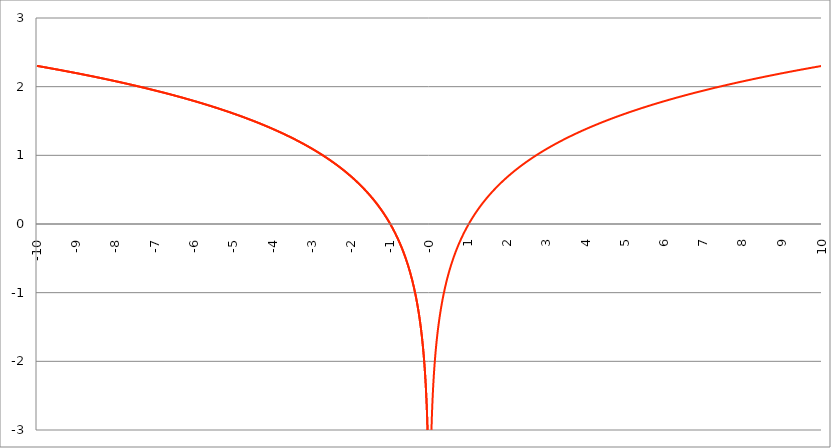
| Category | Series 1 |
|---|---|
| -10.0 | 2.303 |
| -9.99 | 2.302 |
| -9.98 | 2.301 |
| -9.97 | 2.3 |
| -9.96 | 2.299 |
| -9.95 | 2.298 |
| -9.940000000000001 | 2.297 |
| -9.930000000000001 | 2.296 |
| -9.920000000000002 | 2.295 |
| -9.91 | 2.294 |
| -9.900000000000002 | 2.293 |
| -9.890000000000002 | 2.292 |
| -9.880000000000003 | 2.291 |
| -9.870000000000003 | 2.289 |
| -9.860000000000001 | 2.288 |
| -9.850000000000003 | 2.287 |
| -9.840000000000003 | 2.286 |
| -9.830000000000004 | 2.285 |
| -9.820000000000004 | 2.284 |
| -9.810000000000004 | 2.283 |
| -9.800000000000004 | 2.282 |
| -9.790000000000004 | 2.281 |
| -9.780000000000005 | 2.28 |
| -9.770000000000005 | 2.279 |
| -9.760000000000005 | 2.278 |
| -9.750000000000005 | 2.277 |
| -9.740000000000006 | 2.276 |
| -9.730000000000006 | 2.275 |
| -9.720000000000006 | 2.274 |
| -9.710000000000006 | 2.273 |
| -9.700000000000006 | 2.272 |
| -9.690000000000007 | 2.271 |
| -9.680000000000007 | 2.27 |
| -9.670000000000007 | 2.269 |
| -9.660000000000007 | 2.268 |
| -9.650000000000007 | 2.267 |
| -9.640000000000008 | 2.266 |
| -9.630000000000008 | 2.265 |
| -9.620000000000008 | 2.264 |
| -9.610000000000008 | 2.263 |
| -9.600000000000009 | 2.262 |
| -9.590000000000009 | 2.261 |
| -9.580000000000007 | 2.26 |
| -9.57000000000001 | 2.259 |
| -9.56000000000001 | 2.258 |
| -9.55000000000001 | 2.257 |
| -9.54000000000001 | 2.255 |
| -9.53000000000001 | 2.254 |
| -9.52000000000001 | 2.253 |
| -9.51000000000001 | 2.252 |
| -9.50000000000001 | 2.251 |
| -9.49000000000001 | 2.25 |
| -9.48000000000001 | 2.249 |
| -9.47000000000001 | 2.248 |
| -9.46000000000001 | 2.247 |
| -9.45000000000001 | 2.246 |
| -9.44000000000001 | 2.245 |
| -9.430000000000012 | 2.244 |
| -9.420000000000012 | 2.243 |
| -9.410000000000013 | 2.242 |
| -9.400000000000013 | 2.241 |
| -9.390000000000011 | 2.24 |
| -9.380000000000013 | 2.239 |
| -9.370000000000013 | 2.238 |
| -9.360000000000014 | 2.236 |
| -9.350000000000014 | 2.235 |
| -9.340000000000014 | 2.234 |
| -9.330000000000014 | 2.233 |
| -9.320000000000014 | 2.232 |
| -9.310000000000015 | 2.231 |
| -9.300000000000013 | 2.23 |
| -9.290000000000015 | 2.229 |
| -9.280000000000015 | 2.228 |
| -9.270000000000016 | 2.227 |
| -9.260000000000016 | 2.226 |
| -9.250000000000014 | 2.225 |
| -9.240000000000016 | 2.224 |
| -9.230000000000016 | 2.222 |
| -9.220000000000017 | 2.221 |
| -9.210000000000017 | 2.22 |
| -9.200000000000017 | 2.219 |
| -9.190000000000017 | 2.218 |
| -9.180000000000017 | 2.217 |
| -9.170000000000018 | 2.216 |
| -9.160000000000016 | 2.215 |
| -9.150000000000018 | 2.214 |
| -9.140000000000018 | 2.213 |
| -9.130000000000019 | 2.212 |
| -9.120000000000019 | 2.21 |
| -9.110000000000017 | 2.209 |
| -9.10000000000002 | 2.208 |
| -9.09000000000002 | 2.207 |
| -9.08000000000002 | 2.206 |
| -9.07000000000002 | 2.205 |
| -9.06000000000002 | 2.204 |
| -9.05000000000002 | 2.203 |
| -9.04000000000002 | 2.202 |
| -9.03000000000002 | 2.201 |
| -9.020000000000021 | 2.199 |
| -9.010000000000021 | 2.198 |
| -9.000000000000021 | 2.197 |
| -8.990000000000022 | 2.196 |
| -8.980000000000022 | 2.195 |
| -8.97000000000002 | 2.194 |
| -8.960000000000022 | 2.193 |
| -8.950000000000022 | 2.192 |
| -8.940000000000023 | 2.191 |
| -8.930000000000023 | 2.189 |
| -8.920000000000023 | 2.188 |
| -8.910000000000023 | 2.187 |
| -8.900000000000023 | 2.186 |
| -8.890000000000024 | 2.185 |
| -8.880000000000024 | 2.184 |
| -8.870000000000024 | 2.183 |
| -8.860000000000024 | 2.182 |
| -8.850000000000025 | 2.18 |
| -8.840000000000025 | 2.179 |
| -8.830000000000025 | 2.178 |
| -8.820000000000025 | 2.177 |
| -8.810000000000025 | 2.176 |
| -8.800000000000026 | 2.175 |
| -8.790000000000026 | 2.174 |
| -8.780000000000026 | 2.172 |
| -8.770000000000026 | 2.171 |
| -8.760000000000026 | 2.17 |
| -8.750000000000027 | 2.169 |
| -8.740000000000027 | 2.168 |
| -8.730000000000027 | 2.167 |
| -8.720000000000027 | 2.166 |
| -8.710000000000027 | 2.164 |
| -8.700000000000028 | 2.163 |
| -8.690000000000028 | 2.162 |
| -8.680000000000028 | 2.161 |
| -8.670000000000028 | 2.16 |
| -8.660000000000029 | 2.159 |
| -8.650000000000029 | 2.158 |
| -8.640000000000029 | 2.156 |
| -8.63000000000003 | 2.155 |
| -8.62000000000003 | 2.154 |
| -8.61000000000003 | 2.153 |
| -8.60000000000003 | 2.152 |
| -8.59000000000003 | 2.151 |
| -8.58000000000003 | 2.149 |
| -8.57000000000003 | 2.148 |
| -8.56000000000003 | 2.147 |
| -8.55000000000003 | 2.146 |
| -8.540000000000031 | 2.145 |
| -8.530000000000031 | 2.144 |
| -8.520000000000032 | 2.142 |
| -8.510000000000032 | 2.141 |
| -8.50000000000003 | 2.14 |
| -8.490000000000032 | 2.139 |
| -8.480000000000032 | 2.138 |
| -8.470000000000033 | 2.137 |
| -8.460000000000033 | 2.135 |
| -8.450000000000033 | 2.134 |
| -8.440000000000033 | 2.133 |
| -8.430000000000033 | 2.132 |
| -8.420000000000034 | 2.131 |
| -8.410000000000032 | 2.129 |
| -8.400000000000034 | 2.128 |
| -8.390000000000034 | 2.127 |
| -8.380000000000035 | 2.126 |
| -8.370000000000035 | 2.125 |
| -8.360000000000033 | 2.123 |
| -8.350000000000035 | 2.122 |
| -8.340000000000035 | 2.121 |
| -8.330000000000036 | 2.12 |
| -8.320000000000036 | 2.119 |
| -8.310000000000034 | 2.117 |
| -8.300000000000036 | 2.116 |
| -8.290000000000036 | 2.115 |
| -8.280000000000037 | 2.114 |
| -8.270000000000037 | 2.113 |
| -8.260000000000037 | 2.111 |
| -8.250000000000037 | 2.11 |
| -8.240000000000038 | 2.109 |
| -8.230000000000038 | 2.108 |
| -8.220000000000038 | 2.107 |
| -8.210000000000038 | 2.105 |
| -8.200000000000038 | 2.104 |
| -8.190000000000039 | 2.103 |
| -8.180000000000039 | 2.102 |
| -8.170000000000037 | 2.1 |
| -8.16000000000004 | 2.099 |
| -8.15000000000004 | 2.098 |
| -8.14000000000004 | 2.097 |
| -8.13000000000004 | 2.096 |
| -8.12000000000004 | 2.094 |
| -8.11000000000004 | 2.093 |
| -8.10000000000004 | 2.092 |
| -8.09000000000004 | 2.091 |
| -8.08000000000004 | 2.089 |
| -8.07000000000004 | 2.088 |
| -8.06000000000004 | 2.087 |
| -8.05000000000004 | 2.086 |
| -8.040000000000042 | 2.084 |
| -8.03000000000004 | 2.083 |
| -8.020000000000042 | 2.082 |
| -8.010000000000042 | 2.081 |
| -8.000000000000043 | 2.079 |
| -7.990000000000043 | 2.078 |
| -7.980000000000043 | 2.077 |
| -7.970000000000043 | 2.076 |
| -7.960000000000043 | 2.074 |
| -7.950000000000044 | 2.073 |
| -7.940000000000044 | 2.072 |
| -7.930000000000044 | 2.071 |
| -7.920000000000044 | 2.069 |
| -7.910000000000044 | 2.068 |
| -7.900000000000044 | 2.067 |
| -7.890000000000045 | 2.066 |
| -7.880000000000045 | 2.064 |
| -7.870000000000045 | 2.063 |
| -7.860000000000046 | 2.062 |
| -7.850000000000046 | 2.061 |
| -7.840000000000046 | 2.059 |
| -7.830000000000046 | 2.058 |
| -7.820000000000046 | 2.057 |
| -7.810000000000047 | 2.055 |
| -7.800000000000047 | 2.054 |
| -7.790000000000047 | 2.053 |
| -7.780000000000047 | 2.052 |
| -7.770000000000047 | 2.05 |
| -7.760000000000048 | 2.049 |
| -7.750000000000048 | 2.048 |
| -7.740000000000048 | 2.046 |
| -7.730000000000048 | 2.045 |
| -7.720000000000049 | 2.044 |
| -7.710000000000049 | 2.043 |
| -7.700000000000049 | 2.041 |
| -7.690000000000049 | 2.04 |
| -7.680000000000049 | 2.039 |
| -7.67000000000005 | 2.037 |
| -7.66000000000005 | 2.036 |
| -7.65000000000005 | 2.035 |
| -7.64000000000005 | 2.033 |
| -7.63000000000005 | 2.032 |
| -7.620000000000051 | 2.031 |
| -7.610000000000051 | 2.029 |
| -7.600000000000051 | 2.028 |
| -7.590000000000051 | 2.027 |
| -7.580000000000052 | 2.026 |
| -7.570000000000052 | 2.024 |
| -7.560000000000052 | 2.023 |
| -7.550000000000052 | 2.022 |
| -7.540000000000052 | 2.02 |
| -7.530000000000053 | 2.019 |
| -7.520000000000053 | 2.018 |
| -7.510000000000053 | 2.016 |
| -7.500000000000053 | 2.015 |
| -7.490000000000053 | 2.014 |
| -7.480000000000054 | 2.012 |
| -7.470000000000054 | 2.011 |
| -7.460000000000054 | 2.01 |
| -7.450000000000054 | 2.008 |
| -7.440000000000054 | 2.007 |
| -7.430000000000054 | 2.006 |
| -7.420000000000055 | 2.004 |
| -7.410000000000055 | 2.003 |
| -7.400000000000055 | 2.001 |
| -7.390000000000056 | 2 |
| -7.380000000000056 | 1.999 |
| -7.370000000000056 | 1.997 |
| -7.360000000000056 | 1.996 |
| -7.350000000000056 | 1.995 |
| -7.340000000000057 | 1.993 |
| -7.330000000000057 | 1.992 |
| -7.320000000000057 | 1.991 |
| -7.310000000000057 | 1.989 |
| -7.300000000000058 | 1.988 |
| -7.290000000000058 | 1.987 |
| -7.280000000000058 | 1.985 |
| -7.270000000000058 | 1.984 |
| -7.260000000000058 | 1.982 |
| -7.250000000000059 | 1.981 |
| -7.240000000000059 | 1.98 |
| -7.23000000000006 | 1.978 |
| -7.220000000000059 | 1.977 |
| -7.210000000000059 | 1.975 |
| -7.20000000000006 | 1.974 |
| -7.19000000000006 | 1.973 |
| -7.18000000000006 | 1.971 |
| -7.17000000000006 | 1.97 |
| -7.160000000000061 | 1.969 |
| -7.150000000000061 | 1.967 |
| -7.140000000000061 | 1.966 |
| -7.130000000000061 | 1.964 |
| -7.120000000000061 | 1.963 |
| -7.110000000000062 | 1.962 |
| -7.100000000000062 | 1.96 |
| -7.090000000000062 | 1.959 |
| -7.080000000000062 | 1.957 |
| -7.070000000000062 | 1.956 |
| -7.060000000000063 | 1.954 |
| -7.050000000000063 | 1.953 |
| -7.040000000000063 | 1.952 |
| -7.030000000000063 | 1.95 |
| -7.020000000000064 | 1.949 |
| -7.010000000000064 | 1.947 |
| -7.000000000000064 | 1.946 |
| -6.990000000000064 | 1.944 |
| -6.980000000000064 | 1.943 |
| -6.970000000000064 | 1.942 |
| -6.960000000000064 | 1.94 |
| -6.950000000000064 | 1.939 |
| -6.940000000000065 | 1.937 |
| -6.930000000000065 | 1.936 |
| -6.920000000000065 | 1.934 |
| -6.910000000000065 | 1.933 |
| -6.900000000000066 | 1.932 |
| -6.890000000000066 | 1.93 |
| -6.880000000000066 | 1.929 |
| -6.870000000000066 | 1.927 |
| -6.860000000000067 | 1.926 |
| -6.850000000000067 | 1.924 |
| -6.840000000000067 | 1.923 |
| -6.830000000000067 | 1.921 |
| -6.820000000000068 | 1.92 |
| -6.810000000000068 | 1.918 |
| -6.800000000000068 | 1.917 |
| -6.790000000000068 | 1.915 |
| -6.780000000000068 | 1.914 |
| -6.770000000000068 | 1.913 |
| -6.760000000000069 | 1.911 |
| -6.75000000000007 | 1.91 |
| -6.74000000000007 | 1.908 |
| -6.73000000000007 | 1.907 |
| -6.72000000000007 | 1.905 |
| -6.71000000000007 | 1.904 |
| -6.70000000000007 | 1.902 |
| -6.69000000000007 | 1.901 |
| -6.680000000000071 | 1.899 |
| -6.670000000000071 | 1.898 |
| -6.660000000000071 | 1.896 |
| -6.650000000000071 | 1.895 |
| -6.640000000000072 | 1.893 |
| -6.630000000000072 | 1.892 |
| -6.620000000000072 | 1.89 |
| -6.610000000000072 | 1.889 |
| -6.600000000000072 | 1.887 |
| -6.590000000000073 | 1.886 |
| -6.580000000000073 | 1.884 |
| -6.570000000000073 | 1.883 |
| -6.560000000000073 | 1.881 |
| -6.550000000000074 | 1.879 |
| -6.540000000000074 | 1.878 |
| -6.530000000000074 | 1.876 |
| -6.520000000000074 | 1.875 |
| -6.510000000000074 | 1.873 |
| -6.500000000000074 | 1.872 |
| -6.490000000000074 | 1.87 |
| -6.480000000000074 | 1.869 |
| -6.470000000000075 | 1.867 |
| -6.460000000000075 | 1.866 |
| -6.450000000000075 | 1.864 |
| -6.440000000000075 | 1.863 |
| -6.430000000000076 | 1.861 |
| -6.420000000000076 | 1.859 |
| -6.410000000000076 | 1.858 |
| -6.400000000000076 | 1.856 |
| -6.390000000000077 | 1.855 |
| -6.380000000000077 | 1.853 |
| -6.370000000000077 | 1.852 |
| -6.360000000000078 | 1.85 |
| -6.350000000000078 | 1.848 |
| -6.340000000000078 | 1.847 |
| -6.330000000000078 | 1.845 |
| -6.320000000000078 | 1.844 |
| -6.310000000000079 | 1.842 |
| -6.300000000000079 | 1.841 |
| -6.29000000000008 | 1.839 |
| -6.28000000000008 | 1.837 |
| -6.27000000000008 | 1.836 |
| -6.26000000000008 | 1.834 |
| -6.25000000000008 | 1.833 |
| -6.24000000000008 | 1.831 |
| -6.23000000000008 | 1.829 |
| -6.220000000000081 | 1.828 |
| -6.210000000000081 | 1.826 |
| -6.200000000000081 | 1.825 |
| -6.190000000000081 | 1.823 |
| -6.180000000000081 | 1.821 |
| -6.170000000000082 | 1.82 |
| -6.160000000000082 | 1.818 |
| -6.150000000000082 | 1.816 |
| -6.140000000000082 | 1.815 |
| -6.130000000000082 | 1.813 |
| -6.120000000000083 | 1.812 |
| -6.110000000000083 | 1.81 |
| -6.100000000000083 | 1.808 |
| -6.090000000000083 | 1.807 |
| -6.080000000000084 | 1.805 |
| -6.070000000000084 | 1.803 |
| -6.060000000000084 | 1.802 |
| -6.050000000000084 | 1.8 |
| -6.040000000000084 | 1.798 |
| -6.030000000000084 | 1.797 |
| -6.020000000000085 | 1.795 |
| -6.010000000000085 | 1.793 |
| -6.000000000000085 | 1.792 |
| -5.990000000000085 | 1.79 |
| -5.980000000000085 | 1.788 |
| -5.970000000000085 | 1.787 |
| -5.960000000000086 | 1.785 |
| -5.950000000000086 | 1.783 |
| -5.940000000000086 | 1.782 |
| -5.930000000000086 | 1.78 |
| -5.920000000000087 | 1.778 |
| -5.910000000000087 | 1.777 |
| -5.900000000000087 | 1.775 |
| -5.890000000000088 | 1.773 |
| -5.880000000000088 | 1.772 |
| -5.870000000000088 | 1.77 |
| -5.860000000000088 | 1.768 |
| -5.850000000000088 | 1.766 |
| -5.840000000000089 | 1.765 |
| -5.830000000000089 | 1.763 |
| -5.820000000000089 | 1.761 |
| -5.810000000000089 | 1.76 |
| -5.800000000000089 | 1.758 |
| -5.79000000000009 | 1.756 |
| -5.78000000000009 | 1.754 |
| -5.77000000000009 | 1.753 |
| -5.76000000000009 | 1.751 |
| -5.750000000000091 | 1.749 |
| -5.740000000000091 | 1.747 |
| -5.730000000000091 | 1.746 |
| -5.720000000000091 | 1.744 |
| -5.710000000000091 | 1.742 |
| -5.700000000000092 | 1.74 |
| -5.690000000000092 | 1.739 |
| -5.680000000000092 | 1.737 |
| -5.670000000000092 | 1.735 |
| -5.660000000000092 | 1.733 |
| -5.650000000000093 | 1.732 |
| -5.640000000000093 | 1.73 |
| -5.630000000000093 | 1.728 |
| -5.620000000000093 | 1.726 |
| -5.610000000000093 | 1.725 |
| -5.600000000000094 | 1.723 |
| -5.590000000000094 | 1.721 |
| -5.580000000000094 | 1.719 |
| -5.570000000000094 | 1.717 |
| -5.560000000000095 | 1.716 |
| -5.550000000000095 | 1.714 |
| -5.540000000000095 | 1.712 |
| -5.530000000000095 | 1.71 |
| -5.520000000000095 | 1.708 |
| -5.510000000000096 | 1.707 |
| -5.500000000000096 | 1.705 |
| -5.490000000000096 | 1.703 |
| -5.480000000000096 | 1.701 |
| -5.470000000000096 | 1.699 |
| -5.460000000000097 | 1.697 |
| -5.450000000000097 | 1.696 |
| -5.440000000000097 | 1.694 |
| -5.430000000000097 | 1.692 |
| -5.420000000000098 | 1.69 |
| -5.410000000000098 | 1.688 |
| -5.400000000000098 | 1.686 |
| -5.390000000000098 | 1.685 |
| -5.380000000000098 | 1.683 |
| -5.370000000000099 | 1.681 |
| -5.360000000000099 | 1.679 |
| -5.350000000000099 | 1.677 |
| -5.340000000000099 | 1.675 |
| -5.330000000000099 | 1.673 |
| -5.3200000000001 | 1.671 |
| -5.3100000000001 | 1.67 |
| -5.3000000000001 | 1.668 |
| -5.2900000000001 | 1.666 |
| -5.2800000000001 | 1.664 |
| -5.2700000000001 | 1.662 |
| -5.260000000000101 | 1.66 |
| -5.250000000000101 | 1.658 |
| -5.240000000000101 | 1.656 |
| -5.230000000000101 | 1.654 |
| -5.220000000000102 | 1.652 |
| -5.210000000000102 | 1.651 |
| -5.200000000000102 | 1.649 |
| -5.190000000000103 | 1.647 |
| -5.180000000000103 | 1.645 |
| -5.170000000000103 | 1.643 |
| -5.160000000000103 | 1.641 |
| -5.150000000000103 | 1.639 |
| -5.140000000000104 | 1.637 |
| -5.130000000000104 | 1.635 |
| -5.120000000000104 | 1.633 |
| -5.110000000000104 | 1.631 |
| -5.100000000000104 | 1.629 |
| -5.090000000000104 | 1.627 |
| -5.080000000000104 | 1.625 |
| -5.070000000000105 | 1.623 |
| -5.060000000000105 | 1.621 |
| -5.050000000000105 | 1.619 |
| -5.040000000000105 | 1.617 |
| -5.030000000000105 | 1.615 |
| -5.020000000000106 | 1.613 |
| -5.010000000000106 | 1.611 |
| -5.000000000000106 | 1.609 |
| -4.990000000000106 | 1.607 |
| -4.980000000000106 | 1.605 |
| -4.970000000000107 | 1.603 |
| -4.960000000000107 | 1.601 |
| -4.950000000000107 | 1.599 |
| -4.940000000000107 | 1.597 |
| -4.930000000000108 | 1.595 |
| -4.920000000000108 | 1.593 |
| -4.910000000000108 | 1.591 |
| -4.900000000000108 | 1.589 |
| -4.890000000000109 | 1.587 |
| -4.88000000000011 | 1.585 |
| -4.87000000000011 | 1.583 |
| -4.86000000000011 | 1.581 |
| -4.85000000000011 | 1.579 |
| -4.84000000000011 | 1.577 |
| -4.83000000000011 | 1.575 |
| -4.82000000000011 | 1.573 |
| -4.810000000000111 | 1.571 |
| -4.800000000000111 | 1.569 |
| -4.790000000000111 | 1.567 |
| -4.780000000000111 | 1.564 |
| -4.770000000000111 | 1.562 |
| -4.760000000000112 | 1.56 |
| -4.750000000000112 | 1.558 |
| -4.740000000000112 | 1.556 |
| -4.730000000000112 | 1.554 |
| -4.720000000000112 | 1.552 |
| -4.710000000000113 | 1.55 |
| -4.700000000000113 | 1.548 |
| -4.690000000000113 | 1.545 |
| -4.680000000000113 | 1.543 |
| -4.670000000000114 | 1.541 |
| -4.660000000000114 | 1.539 |
| -4.650000000000114 | 1.537 |
| -4.640000000000114 | 1.535 |
| -4.630000000000114 | 1.533 |
| -4.620000000000115 | 1.53 |
| -4.610000000000115 | 1.528 |
| -4.600000000000115 | 1.526 |
| -4.590000000000115 | 1.524 |
| -4.580000000000115 | 1.522 |
| -4.570000000000115 | 1.52 |
| -4.560000000000116 | 1.517 |
| -4.550000000000116 | 1.515 |
| -4.540000000000116 | 1.513 |
| -4.530000000000116 | 1.511 |
| -4.520000000000117 | 1.509 |
| -4.510000000000117 | 1.506 |
| -4.500000000000117 | 1.504 |
| -4.490000000000117 | 1.502 |
| -4.480000000000117 | 1.5 |
| -4.470000000000117 | 1.497 |
| -4.460000000000118 | 1.495 |
| -4.450000000000118 | 1.493 |
| -4.440000000000118 | 1.491 |
| -4.430000000000118 | 1.488 |
| -4.420000000000119 | 1.486 |
| -4.41000000000012 | 1.484 |
| -4.40000000000012 | 1.482 |
| -4.39000000000012 | 1.479 |
| -4.38000000000012 | 1.477 |
| -4.37000000000012 | 1.475 |
| -4.36000000000012 | 1.472 |
| -4.35000000000012 | 1.47 |
| -4.34000000000012 | 1.468 |
| -4.33000000000012 | 1.466 |
| -4.320000000000121 | 1.463 |
| -4.310000000000121 | 1.461 |
| -4.300000000000121 | 1.459 |
| -4.290000000000121 | 1.456 |
| -4.280000000000121 | 1.454 |
| -4.270000000000122 | 1.452 |
| -4.260000000000122 | 1.449 |
| -4.250000000000122 | 1.447 |
| -4.240000000000122 | 1.445 |
| -4.230000000000122 | 1.442 |
| -4.220000000000123 | 1.44 |
| -4.210000000000123 | 1.437 |
| -4.200000000000123 | 1.435 |
| -4.190000000000124 | 1.433 |
| -4.180000000000124 | 1.43 |
| -4.170000000000124 | 1.428 |
| -4.160000000000124 | 1.426 |
| -4.150000000000124 | 1.423 |
| -4.140000000000124 | 1.421 |
| -4.130000000000125 | 1.418 |
| -4.120000000000125 | 1.416 |
| -4.110000000000125 | 1.413 |
| -4.100000000000125 | 1.411 |
| -4.090000000000125 | 1.409 |
| -4.080000000000126 | 1.406 |
| -4.070000000000126 | 1.404 |
| -4.060000000000126 | 1.401 |
| -4.050000000000126 | 1.399 |
| -4.040000000000127 | 1.396 |
| -4.030000000000127 | 1.394 |
| -4.020000000000127 | 1.391 |
| -4.010000000000127 | 1.389 |
| -4.000000000000127 | 1.386 |
| -3.990000000000128 | 1.384 |
| -3.980000000000128 | 1.381 |
| -3.970000000000129 | 1.379 |
| -3.960000000000129 | 1.376 |
| -3.950000000000129 | 1.374 |
| -3.940000000000129 | 1.371 |
| -3.930000000000129 | 1.369 |
| -3.92000000000013 | 1.366 |
| -3.91000000000013 | 1.364 |
| -3.90000000000013 | 1.361 |
| -3.89000000000013 | 1.358 |
| -3.88000000000013 | 1.356 |
| -3.870000000000131 | 1.353 |
| -3.860000000000131 | 1.351 |
| -3.850000000000131 | 1.348 |
| -3.840000000000131 | 1.345 |
| -3.830000000000131 | 1.343 |
| -3.820000000000132 | 1.34 |
| -3.810000000000132 | 1.338 |
| -3.800000000000132 | 1.335 |
| -3.790000000000132 | 1.332 |
| -3.780000000000132 | 1.33 |
| -3.770000000000133 | 1.327 |
| -3.760000000000133 | 1.324 |
| -3.750000000000133 | 1.322 |
| -3.740000000000133 | 1.319 |
| -3.730000000000134 | 1.316 |
| -3.720000000000134 | 1.314 |
| -3.710000000000134 | 1.311 |
| -3.700000000000134 | 1.308 |
| -3.690000000000134 | 1.306 |
| -3.680000000000135 | 1.303 |
| -3.670000000000135 | 1.3 |
| -3.660000000000135 | 1.297 |
| -3.650000000000135 | 1.295 |
| -3.640000000000135 | 1.292 |
| -3.630000000000136 | 1.289 |
| -3.620000000000136 | 1.286 |
| -3.610000000000136 | 1.284 |
| -3.600000000000136 | 1.281 |
| -3.590000000000137 | 1.278 |
| -3.580000000000137 | 1.275 |
| -3.570000000000137 | 1.273 |
| -3.560000000000137 | 1.27 |
| -3.550000000000137 | 1.267 |
| -3.540000000000138 | 1.264 |
| -3.530000000000138 | 1.261 |
| -3.520000000000138 | 1.258 |
| -3.510000000000138 | 1.256 |
| -3.500000000000139 | 1.253 |
| -3.490000000000139 | 1.25 |
| -3.480000000000139 | 1.247 |
| -3.470000000000139 | 1.244 |
| -3.460000000000139 | 1.241 |
| -3.45000000000014 | 1.238 |
| -3.44000000000014 | 1.235 |
| -3.43000000000014 | 1.233 |
| -3.42000000000014 | 1.23 |
| -3.41000000000014 | 1.227 |
| -3.400000000000141 | 1.224 |
| -3.390000000000141 | 1.221 |
| -3.380000000000141 | 1.218 |
| -3.370000000000141 | 1.215 |
| -3.360000000000141 | 1.212 |
| -3.350000000000142 | 1.209 |
| -3.340000000000142 | 1.206 |
| -3.330000000000142 | 1.203 |
| -3.320000000000142 | 1.2 |
| -3.310000000000143 | 1.197 |
| -3.300000000000143 | 1.194 |
| -3.290000000000143 | 1.191 |
| -3.280000000000143 | 1.188 |
| -3.270000000000143 | 1.185 |
| -3.260000000000144 | 1.182 |
| -3.250000000000144 | 1.179 |
| -3.240000000000144 | 1.176 |
| -3.230000000000144 | 1.172 |
| -3.220000000000145 | 1.169 |
| -3.210000000000145 | 1.166 |
| -3.200000000000145 | 1.163 |
| -3.190000000000145 | 1.16 |
| -3.180000000000145 | 1.157 |
| -3.170000000000146 | 1.154 |
| -3.160000000000146 | 1.151 |
| -3.150000000000146 | 1.147 |
| -3.140000000000146 | 1.144 |
| -3.130000000000146 | 1.141 |
| -3.120000000000147 | 1.138 |
| -3.110000000000147 | 1.135 |
| -3.100000000000147 | 1.131 |
| -3.090000000000147 | 1.128 |
| -3.080000000000147 | 1.125 |
| -3.070000000000148 | 1.122 |
| -3.060000000000148 | 1.118 |
| -3.050000000000148 | 1.115 |
| -3.040000000000148 | 1.112 |
| -3.030000000000149 | 1.109 |
| -3.020000000000149 | 1.105 |
| -3.010000000000149 | 1.102 |
| -3.000000000000149 | 1.099 |
| -2.990000000000149 | 1.095 |
| -2.98000000000015 | 1.092 |
| -2.97000000000015 | 1.089 |
| -2.96000000000015 | 1.085 |
| -2.95000000000015 | 1.082 |
| -2.94000000000015 | 1.078 |
| -2.930000000000151 | 1.075 |
| -2.920000000000151 | 1.072 |
| -2.910000000000151 | 1.068 |
| -2.900000000000151 | 1.065 |
| -2.890000000000151 | 1.061 |
| -2.880000000000152 | 1.058 |
| -2.870000000000152 | 1.054 |
| -2.860000000000152 | 1.051 |
| -2.850000000000152 | 1.047 |
| -2.840000000000153 | 1.044 |
| -2.830000000000153 | 1.04 |
| -2.820000000000153 | 1.037 |
| -2.810000000000153 | 1.033 |
| -2.800000000000153 | 1.03 |
| -2.790000000000154 | 1.026 |
| -2.780000000000154 | 1.022 |
| -2.770000000000154 | 1.019 |
| -2.760000000000154 | 1.015 |
| -2.750000000000154 | 1.012 |
| -2.740000000000155 | 1.008 |
| -2.730000000000155 | 1.004 |
| -2.720000000000155 | 1.001 |
| -2.710000000000155 | 0.997 |
| -2.700000000000156 | 0.993 |
| -2.690000000000156 | 0.99 |
| -2.680000000000156 | 0.986 |
| -2.670000000000156 | 0.982 |
| -2.660000000000156 | 0.978 |
| -2.650000000000157 | 0.975 |
| -2.640000000000157 | 0.971 |
| -2.630000000000157 | 0.967 |
| -2.620000000000157 | 0.963 |
| -2.610000000000157 | 0.959 |
| -2.600000000000158 | 0.956 |
| -2.590000000000158 | 0.952 |
| -2.580000000000158 | 0.948 |
| -2.570000000000158 | 0.944 |
| -2.560000000000159 | 0.94 |
| -2.550000000000159 | 0.936 |
| -2.54000000000016 | 0.932 |
| -2.530000000000159 | 0.928 |
| -2.520000000000159 | 0.924 |
| -2.51000000000016 | 0.92 |
| -2.50000000000016 | 0.916 |
| -2.49000000000016 | 0.912 |
| -2.48000000000016 | 0.908 |
| -2.47000000000016 | 0.904 |
| -2.460000000000161 | 0.9 |
| -2.450000000000161 | 0.896 |
| -2.440000000000161 | 0.892 |
| -2.430000000000161 | 0.888 |
| -2.420000000000162 | 0.884 |
| -2.410000000000162 | 0.88 |
| -2.400000000000162 | 0.875 |
| -2.390000000000162 | 0.871 |
| -2.380000000000162 | 0.867 |
| -2.370000000000163 | 0.863 |
| -2.360000000000163 | 0.859 |
| -2.350000000000163 | 0.854 |
| -2.340000000000163 | 0.85 |
| -2.330000000000163 | 0.846 |
| -2.320000000000164 | 0.842 |
| -2.310000000000164 | 0.837 |
| -2.300000000000164 | 0.833 |
| -2.290000000000164 | 0.829 |
| -2.280000000000165 | 0.824 |
| -2.270000000000165 | 0.82 |
| -2.260000000000165 | 0.815 |
| -2.250000000000165 | 0.811 |
| -2.240000000000165 | 0.806 |
| -2.230000000000166 | 0.802 |
| -2.220000000000166 | 0.798 |
| -2.210000000000166 | 0.793 |
| -2.200000000000166 | 0.788 |
| -2.190000000000166 | 0.784 |
| -2.180000000000167 | 0.779 |
| -2.170000000000167 | 0.775 |
| -2.160000000000167 | 0.77 |
| -2.150000000000167 | 0.765 |
| -2.140000000000168 | 0.761 |
| -2.130000000000168 | 0.756 |
| -2.120000000000168 | 0.751 |
| -2.110000000000168 | 0.747 |
| -2.100000000000168 | 0.742 |
| -2.090000000000169 | 0.737 |
| -2.080000000000169 | 0.732 |
| -2.070000000000169 | 0.728 |
| -2.060000000000169 | 0.723 |
| -2.050000000000169 | 0.718 |
| -2.04000000000017 | 0.713 |
| -2.03000000000017 | 0.708 |
| -2.02000000000017 | 0.703 |
| -2.01000000000017 | 0.698 |
| -2.000000000000171 | 0.693 |
| -1.99000000000017 | 0.688 |
| -1.98000000000017 | 0.683 |
| -1.97000000000017 | 0.678 |
| -1.96000000000017 | 0.673 |
| -1.95000000000017 | 0.668 |
| -1.94000000000017 | 0.663 |
| -1.93000000000017 | 0.658 |
| -1.92000000000017 | 0.652 |
| -1.91000000000017 | 0.647 |
| -1.90000000000017 | 0.642 |
| -1.89000000000017 | 0.637 |
| -1.88000000000017 | 0.631 |
| -1.87000000000017 | 0.626 |
| -1.86000000000017 | 0.621 |
| -1.85000000000017 | 0.615 |
| -1.84000000000017 | 0.61 |
| -1.83000000000017 | 0.604 |
| -1.82000000000017 | 0.599 |
| -1.81000000000017 | 0.593 |
| -1.80000000000017 | 0.588 |
| -1.79000000000017 | 0.582 |
| -1.78000000000017 | 0.577 |
| -1.77000000000017 | 0.571 |
| -1.76000000000017 | 0.565 |
| -1.75000000000017 | 0.56 |
| -1.74000000000017 | 0.554 |
| -1.73000000000017 | 0.548 |
| -1.72000000000017 | 0.542 |
| -1.71000000000017 | 0.536 |
| -1.70000000000017 | 0.531 |
| -1.69000000000017 | 0.525 |
| -1.68000000000017 | 0.519 |
| -1.67000000000017 | 0.513 |
| -1.66000000000017 | 0.507 |
| -1.65000000000017 | 0.501 |
| -1.64000000000017 | 0.495 |
| -1.63000000000017 | 0.489 |
| -1.62000000000017 | 0.482 |
| -1.61000000000017 | 0.476 |
| -1.60000000000017 | 0.47 |
| -1.59000000000017 | 0.464 |
| -1.58000000000017 | 0.457 |
| -1.57000000000017 | 0.451 |
| -1.56000000000017 | 0.445 |
| -1.55000000000017 | 0.438 |
| -1.54000000000017 | 0.432 |
| -1.53000000000017 | 0.425 |
| -1.52000000000017 | 0.419 |
| -1.51000000000017 | 0.412 |
| -1.50000000000017 | 0.405 |
| -1.49000000000017 | 0.399 |
| -1.48000000000017 | 0.392 |
| -1.47000000000017 | 0.385 |
| -1.46000000000017 | 0.378 |
| -1.45000000000017 | 0.372 |
| -1.44000000000017 | 0.365 |
| -1.43000000000017 | 0.358 |
| -1.42000000000017 | 0.351 |
| -1.41000000000017 | 0.344 |
| -1.40000000000017 | 0.336 |
| -1.39000000000017 | 0.329 |
| -1.38000000000017 | 0.322 |
| -1.37000000000017 | 0.315 |
| -1.36000000000017 | 0.307 |
| -1.35000000000017 | 0.3 |
| -1.34000000000017 | 0.293 |
| -1.33000000000017 | 0.285 |
| -1.32000000000017 | 0.278 |
| -1.31000000000017 | 0.27 |
| -1.30000000000017 | 0.262 |
| -1.29000000000017 | 0.255 |
| -1.28000000000017 | 0.247 |
| -1.27000000000017 | 0.239 |
| -1.26000000000017 | 0.231 |
| -1.25000000000017 | 0.223 |
| -1.24000000000017 | 0.215 |
| -1.23000000000017 | 0.207 |
| -1.22000000000017 | 0.199 |
| -1.21000000000017 | 0.191 |
| -1.20000000000017 | 0.182 |
| -1.19000000000017 | 0.174 |
| -1.18000000000017 | 0.166 |
| -1.17000000000017 | 0.157 |
| -1.16000000000017 | 0.148 |
| -1.15000000000017 | 0.14 |
| -1.14000000000017 | 0.131 |
| -1.13000000000017 | 0.122 |
| -1.12000000000017 | 0.113 |
| -1.11000000000017 | 0.104 |
| -1.10000000000017 | 0.095 |
| -1.09000000000017 | 0.086 |
| -1.08000000000017 | 0.077 |
| -1.07000000000017 | 0.068 |
| -1.06000000000017 | 0.058 |
| -1.05000000000017 | 0.049 |
| -1.04000000000017 | 0.039 |
| -1.03000000000017 | 0.03 |
| -1.02000000000017 | 0.02 |
| -1.01000000000017 | 0.01 |
| -1.00000000000017 | 0 |
| -0.99000000000017 | -0.01 |
| -0.98000000000017 | -0.02 |
| -0.97000000000017 | -0.03 |
| -0.96000000000017 | -0.041 |
| -0.95000000000017 | -0.051 |
| -0.94000000000017 | -0.062 |
| -0.93000000000017 | -0.073 |
| -0.92000000000017 | -0.083 |
| -0.91000000000017 | -0.094 |
| -0.90000000000017 | -0.105 |
| -0.890000000000169 | -0.117 |
| -0.880000000000169 | -0.128 |
| -0.870000000000169 | -0.139 |
| -0.860000000000169 | -0.151 |
| -0.850000000000169 | -0.163 |
| -0.840000000000169 | -0.174 |
| -0.830000000000169 | -0.186 |
| -0.820000000000169 | -0.198 |
| -0.810000000000169 | -0.211 |
| -0.800000000000169 | -0.223 |
| -0.790000000000169 | -0.236 |
| -0.780000000000169 | -0.248 |
| -0.770000000000169 | -0.261 |
| -0.760000000000169 | -0.274 |
| -0.750000000000169 | -0.288 |
| -0.740000000000169 | -0.301 |
| -0.730000000000169 | -0.315 |
| -0.720000000000169 | -0.329 |
| -0.710000000000169 | -0.342 |
| -0.700000000000169 | -0.357 |
| -0.690000000000169 | -0.371 |
| -0.680000000000169 | -0.386 |
| -0.670000000000169 | -0.4 |
| -0.660000000000169 | -0.416 |
| -0.650000000000169 | -0.431 |
| -0.640000000000169 | -0.446 |
| -0.630000000000169 | -0.462 |
| -0.620000000000169 | -0.478 |
| -0.610000000000169 | -0.494 |
| -0.600000000000169 | -0.511 |
| -0.590000000000169 | -0.528 |
| -0.580000000000169 | -0.545 |
| -0.570000000000169 | -0.562 |
| -0.560000000000169 | -0.58 |
| -0.550000000000169 | -0.598 |
| -0.540000000000169 | -0.616 |
| -0.530000000000169 | -0.635 |
| -0.520000000000169 | -0.654 |
| -0.510000000000169 | -0.673 |
| -0.500000000000169 | -0.693 |
| -0.490000000000169 | -0.713 |
| -0.480000000000169 | -0.734 |
| -0.470000000000169 | -0.755 |
| -0.460000000000169 | -0.777 |
| -0.450000000000169 | -0.799 |
| -0.440000000000169 | -0.821 |
| -0.430000000000169 | -0.844 |
| -0.420000000000169 | -0.868 |
| -0.410000000000169 | -0.892 |
| -0.400000000000169 | -0.916 |
| -0.390000000000169 | -0.942 |
| -0.380000000000169 | -0.968 |
| -0.370000000000169 | -0.994 |
| -0.360000000000169 | -1.022 |
| -0.350000000000169 | -1.05 |
| -0.340000000000169 | -1.079 |
| -0.330000000000169 | -1.109 |
| -0.320000000000169 | -1.139 |
| -0.310000000000169 | -1.171 |
| -0.300000000000169 | -1.204 |
| -0.290000000000169 | -1.238 |
| -0.280000000000169 | -1.273 |
| -0.270000000000169 | -1.309 |
| -0.260000000000169 | -1.347 |
| -0.250000000000169 | -1.386 |
| -0.240000000000169 | -1.427 |
| -0.230000000000169 | -1.47 |
| -0.220000000000169 | -1.514 |
| -0.210000000000169 | -1.561 |
| -0.200000000000169 | -1.609 |
| -0.190000000000169 | -1.661 |
| -0.180000000000169 | -1.715 |
| -0.170000000000169 | -1.772 |
| -0.160000000000169 | -1.833 |
| -0.150000000000169 | -1.897 |
| -0.140000000000169 | -1.966 |
| -0.130000000000169 | -2.04 |
| -0.120000000000169 | -2.12 |
| -0.110000000000169 | -2.207 |
| -0.100000000000169 | -2.303 |
| -0.0900000000001689 | -2.408 |
| -0.0800000000001689 | -2.526 |
| -0.0700000000001689 | -2.659 |
| -0.0600000000001689 | -2.813 |
| -0.0500000000001689 | -2.996 |
| -0.0400000000001689 | -3.219 |
| -0.0300000000001689 | -3.507 |
| -0.0200000000001689 | -3.912 |
| -0.0100000000001689 | -4.605 |
| -1.6888920817415e-13 | -29.41 |
| 0.00999999999983111 | -4.605 |
| 0.0199999999998311 | -3.912 |
| 0.0299999999998311 | -3.507 |
| 0.0399999999998311 | -3.219 |
| 0.0499999999998311 | -2.996 |
| 0.0599999999998311 | -2.813 |
| 0.0699999999998311 | -2.659 |
| 0.0799999999998311 | -2.526 |
| 0.0899999999998311 | -2.408 |
| 0.0999999999998311 | -2.303 |
| 0.109999999999831 | -2.207 |
| 0.119999999999831 | -2.12 |
| 0.129999999999831 | -2.04 |
| 0.139999999999831 | -1.966 |
| 0.149999999999831 | -1.897 |
| 0.159999999999831 | -1.833 |
| 0.169999999999831 | -1.772 |
| 0.179999999999831 | -1.715 |
| 0.189999999999831 | -1.661 |
| 0.199999999999831 | -1.609 |
| 0.209999999999831 | -1.561 |
| 0.219999999999831 | -1.514 |
| 0.229999999999831 | -1.47 |
| 0.239999999999831 | -1.427 |
| 0.249999999999831 | -1.386 |
| 0.259999999999831 | -1.347 |
| 0.269999999999831 | -1.309 |
| 0.279999999999831 | -1.273 |
| 0.289999999999831 | -1.238 |
| 0.299999999999831 | -1.204 |
| 0.309999999999831 | -1.171 |
| 0.319999999999831 | -1.139 |
| 0.329999999999831 | -1.109 |
| 0.339999999999831 | -1.079 |
| 0.349999999999831 | -1.05 |
| 0.359999999999831 | -1.022 |
| 0.369999999999831 | -0.994 |
| 0.379999999999831 | -0.968 |
| 0.389999999999831 | -0.942 |
| 0.399999999999831 | -0.916 |
| 0.409999999999831 | -0.892 |
| 0.419999999999831 | -0.868 |
| 0.429999999999831 | -0.844 |
| 0.439999999999831 | -0.821 |
| 0.449999999999831 | -0.799 |
| 0.459999999999831 | -0.777 |
| 0.469999999999831 | -0.755 |
| 0.479999999999831 | -0.734 |
| 0.489999999999831 | -0.713 |
| 0.499999999999831 | -0.693 |
| 0.509999999999831 | -0.673 |
| 0.519999999999831 | -0.654 |
| 0.529999999999831 | -0.635 |
| 0.539999999999831 | -0.616 |
| 0.549999999999831 | -0.598 |
| 0.559999999999831 | -0.58 |
| 0.569999999999831 | -0.562 |
| 0.579999999999831 | -0.545 |
| 0.589999999999831 | -0.528 |
| 0.599999999999831 | -0.511 |
| 0.609999999999831 | -0.494 |
| 0.619999999999831 | -0.478 |
| 0.629999999999831 | -0.462 |
| 0.639999999999831 | -0.446 |
| 0.649999999999831 | -0.431 |
| 0.659999999999831 | -0.416 |
| 0.669999999999831 | -0.4 |
| 0.679999999999831 | -0.386 |
| 0.689999999999831 | -0.371 |
| 0.699999999999831 | -0.357 |
| 0.709999999999831 | -0.342 |
| 0.719999999999831 | -0.329 |
| 0.729999999999831 | -0.315 |
| 0.739999999999831 | -0.301 |
| 0.749999999999832 | -0.288 |
| 0.759999999999832 | -0.274 |
| 0.769999999999832 | -0.261 |
| 0.779999999999832 | -0.248 |
| 0.789999999999832 | -0.236 |
| 0.799999999999832 | -0.223 |
| 0.809999999999832 | -0.211 |
| 0.819999999999832 | -0.198 |
| 0.829999999999832 | -0.186 |
| 0.839999999999832 | -0.174 |
| 0.849999999999832 | -0.163 |
| 0.859999999999832 | -0.151 |
| 0.869999999999832 | -0.139 |
| 0.879999999999832 | -0.128 |
| 0.889999999999832 | -0.117 |
| 0.899999999999832 | -0.105 |
| 0.909999999999832 | -0.094 |
| 0.919999999999832 | -0.083 |
| 0.929999999999832 | -0.073 |
| 0.939999999999832 | -0.062 |
| 0.949999999999832 | -0.051 |
| 0.959999999999832 | -0.041 |
| 0.969999999999832 | -0.03 |
| 0.979999999999832 | -0.02 |
| 0.989999999999832 | -0.01 |
| 0.999999999999832 | 0 |
| 1.009999999999832 | 0.01 |
| 1.019999999999832 | 0.02 |
| 1.029999999999832 | 0.03 |
| 1.039999999999832 | 0.039 |
| 1.049999999999832 | 0.049 |
| 1.059999999999832 | 0.058 |
| 1.069999999999832 | 0.068 |
| 1.079999999999832 | 0.077 |
| 1.089999999999832 | 0.086 |
| 1.099999999999832 | 0.095 |
| 1.109999999999832 | 0.104 |
| 1.119999999999832 | 0.113 |
| 1.129999999999832 | 0.122 |
| 1.139999999999832 | 0.131 |
| 1.149999999999832 | 0.14 |
| 1.159999999999832 | 0.148 |
| 1.169999999999832 | 0.157 |
| 1.179999999999832 | 0.166 |
| 1.189999999999832 | 0.174 |
| 1.199999999999832 | 0.182 |
| 1.209999999999832 | 0.191 |
| 1.219999999999832 | 0.199 |
| 1.229999999999832 | 0.207 |
| 1.239999999999832 | 0.215 |
| 1.249999999999832 | 0.223 |
| 1.259999999999832 | 0.231 |
| 1.269999999999832 | 0.239 |
| 1.279999999999832 | 0.247 |
| 1.289999999999832 | 0.255 |
| 1.299999999999832 | 0.262 |
| 1.309999999999832 | 0.27 |
| 1.319999999999832 | 0.278 |
| 1.329999999999832 | 0.285 |
| 1.339999999999832 | 0.293 |
| 1.349999999999832 | 0.3 |
| 1.359999999999832 | 0.307 |
| 1.369999999999832 | 0.315 |
| 1.379999999999832 | 0.322 |
| 1.389999999999832 | 0.329 |
| 1.399999999999832 | 0.336 |
| 1.409999999999832 | 0.344 |
| 1.419999999999832 | 0.351 |
| 1.429999999999832 | 0.358 |
| 1.439999999999832 | 0.365 |
| 1.449999999999832 | 0.372 |
| 1.459999999999832 | 0.378 |
| 1.469999999999832 | 0.385 |
| 1.479999999999832 | 0.392 |
| 1.489999999999832 | 0.399 |
| 1.499999999999832 | 0.405 |
| 1.509999999999832 | 0.412 |
| 1.519999999999832 | 0.419 |
| 1.529999999999832 | 0.425 |
| 1.539999999999832 | 0.432 |
| 1.549999999999832 | 0.438 |
| 1.559999999999832 | 0.445 |
| 1.569999999999832 | 0.451 |
| 1.579999999999832 | 0.457 |
| 1.589999999999832 | 0.464 |
| 1.599999999999832 | 0.47 |
| 1.609999999999832 | 0.476 |
| 1.619999999999832 | 0.482 |
| 1.629999999999832 | 0.489 |
| 1.639999999999832 | 0.495 |
| 1.649999999999832 | 0.501 |
| 1.659999999999832 | 0.507 |
| 1.669999999999832 | 0.513 |
| 1.679999999999832 | 0.519 |
| 1.689999999999832 | 0.525 |
| 1.699999999999832 | 0.531 |
| 1.709999999999832 | 0.536 |
| 1.719999999999832 | 0.542 |
| 1.729999999999832 | 0.548 |
| 1.739999999999832 | 0.554 |
| 1.749999999999832 | 0.56 |
| 1.759999999999832 | 0.565 |
| 1.769999999999832 | 0.571 |
| 1.779999999999832 | 0.577 |
| 1.789999999999832 | 0.582 |
| 1.799999999999832 | 0.588 |
| 1.809999999999832 | 0.593 |
| 1.819999999999832 | 0.599 |
| 1.829999999999832 | 0.604 |
| 1.839999999999832 | 0.61 |
| 1.849999999999832 | 0.615 |
| 1.859999999999832 | 0.621 |
| 1.869999999999832 | 0.626 |
| 1.879999999999832 | 0.631 |
| 1.889999999999832 | 0.637 |
| 1.899999999999832 | 0.642 |
| 1.909999999999832 | 0.647 |
| 1.919999999999832 | 0.652 |
| 1.929999999999832 | 0.658 |
| 1.939999999999832 | 0.663 |
| 1.949999999999833 | 0.668 |
| 1.959999999999833 | 0.673 |
| 1.969999999999833 | 0.678 |
| 1.979999999999833 | 0.683 |
| 1.989999999999833 | 0.688 |
| 1.999999999999833 | 0.693 |
| 2.009999999999832 | 0.698 |
| 2.019999999999832 | 0.703 |
| 2.029999999999832 | 0.708 |
| 2.039999999999832 | 0.713 |
| 2.049999999999832 | 0.718 |
| 2.059999999999831 | 0.723 |
| 2.069999999999831 | 0.728 |
| 2.079999999999831 | 0.732 |
| 2.089999999999831 | 0.737 |
| 2.09999999999983 | 0.742 |
| 2.10999999999983 | 0.747 |
| 2.11999999999983 | 0.751 |
| 2.12999999999983 | 0.756 |
| 2.13999999999983 | 0.761 |
| 2.149999999999829 | 0.765 |
| 2.159999999999829 | 0.77 |
| 2.169999999999829 | 0.775 |
| 2.179999999999829 | 0.779 |
| 2.189999999999829 | 0.784 |
| 2.199999999999828 | 0.788 |
| 2.209999999999828 | 0.793 |
| 2.219999999999828 | 0.798 |
| 2.229999999999828 | 0.802 |
| 2.239999999999827 | 0.806 |
| 2.249999999999827 | 0.811 |
| 2.259999999999827 | 0.815 |
| 2.269999999999827 | 0.82 |
| 2.279999999999827 | 0.824 |
| 2.289999999999826 | 0.829 |
| 2.299999999999826 | 0.833 |
| 2.309999999999826 | 0.837 |
| 2.319999999999826 | 0.842 |
| 2.329999999999825 | 0.846 |
| 2.339999999999825 | 0.85 |
| 2.349999999999825 | 0.854 |
| 2.359999999999825 | 0.859 |
| 2.369999999999825 | 0.863 |
| 2.379999999999824 | 0.867 |
| 2.389999999999824 | 0.871 |
| 2.399999999999824 | 0.875 |
| 2.409999999999824 | 0.88 |
| 2.419999999999824 | 0.884 |
| 2.429999999999823 | 0.888 |
| 2.439999999999823 | 0.892 |
| 2.449999999999823 | 0.896 |
| 2.459999999999823 | 0.9 |
| 2.469999999999823 | 0.904 |
| 2.479999999999822 | 0.908 |
| 2.489999999999822 | 0.912 |
| 2.499999999999822 | 0.916 |
| 2.509999999999822 | 0.92 |
| 2.519999999999821 | 0.924 |
| 2.529999999999821 | 0.928 |
| 2.539999999999821 | 0.932 |
| 2.549999999999821 | 0.936 |
| 2.559999999999821 | 0.94 |
| 2.56999999999982 | 0.944 |
| 2.57999999999982 | 0.948 |
| 2.58999999999982 | 0.952 |
| 2.59999999999982 | 0.956 |
| 2.609999999999819 | 0.959 |
| 2.619999999999819 | 0.963 |
| 2.629999999999819 | 0.967 |
| 2.639999999999819 | 0.971 |
| 2.649999999999819 | 0.975 |
| 2.659999999999818 | 0.978 |
| 2.669999999999818 | 0.982 |
| 2.679999999999818 | 0.986 |
| 2.689999999999818 | 0.99 |
| 2.699999999999818 | 0.993 |
| 2.709999999999817 | 0.997 |
| 2.719999999999817 | 1.001 |
| 2.729999999999817 | 1.004 |
| 2.739999999999817 | 1.008 |
| 2.749999999999817 | 1.012 |
| 2.759999999999816 | 1.015 |
| 2.769999999999816 | 1.019 |
| 2.779999999999816 | 1.022 |
| 2.789999999999816 | 1.026 |
| 2.799999999999815 | 1.03 |
| 2.809999999999815 | 1.033 |
| 2.819999999999815 | 1.037 |
| 2.829999999999815 | 1.04 |
| 2.839999999999815 | 1.044 |
| 2.849999999999814 | 1.047 |
| 2.859999999999814 | 1.051 |
| 2.869999999999814 | 1.054 |
| 2.879999999999814 | 1.058 |
| 2.889999999999814 | 1.061 |
| 2.899999999999813 | 1.065 |
| 2.909999999999813 | 1.068 |
| 2.919999999999813 | 1.072 |
| 2.929999999999813 | 1.075 |
| 2.939999999999813 | 1.078 |
| 2.949999999999812 | 1.082 |
| 2.959999999999812 | 1.085 |
| 2.969999999999812 | 1.089 |
| 2.979999999999812 | 1.092 |
| 2.989999999999811 | 1.095 |
| 2.999999999999811 | 1.099 |
| 3.009999999999811 | 1.102 |
| 3.019999999999811 | 1.105 |
| 3.029999999999811 | 1.109 |
| 3.03999999999981 | 1.112 |
| 3.04999999999981 | 1.115 |
| 3.05999999999981 | 1.118 |
| 3.06999999999981 | 1.122 |
| 3.07999999999981 | 1.125 |
| 3.089999999999809 | 1.128 |
| 3.099999999999809 | 1.131 |
| 3.109999999999809 | 1.135 |
| 3.119999999999809 | 1.138 |
| 3.129999999999808 | 1.141 |
| 3.139999999999808 | 1.144 |
| 3.149999999999808 | 1.147 |
| 3.159999999999808 | 1.151 |
| 3.169999999999808 | 1.154 |
| 3.179999999999807 | 1.157 |
| 3.189999999999807 | 1.16 |
| 3.199999999999807 | 1.163 |
| 3.209999999999807 | 1.166 |
| 3.219999999999807 | 1.169 |
| 3.229999999999806 | 1.172 |
| 3.239999999999806 | 1.176 |
| 3.249999999999806 | 1.179 |
| 3.259999999999806 | 1.182 |
| 3.269999999999805 | 1.185 |
| 3.279999999999805 | 1.188 |
| 3.289999999999805 | 1.191 |
| 3.299999999999805 | 1.194 |
| 3.309999999999805 | 1.197 |
| 3.319999999999804 | 1.2 |
| 3.329999999999804 | 1.203 |
| 3.339999999999804 | 1.206 |
| 3.349999999999804 | 1.209 |
| 3.359999999999804 | 1.212 |
| 3.369999999999803 | 1.215 |
| 3.379999999999803 | 1.218 |
| 3.389999999999803 | 1.221 |
| 3.399999999999803 | 1.224 |
| 3.409999999999802 | 1.227 |
| 3.419999999999802 | 1.23 |
| 3.429999999999802 | 1.233 |
| 3.439999999999802 | 1.235 |
| 3.449999999999802 | 1.238 |
| 3.459999999999801 | 1.241 |
| 3.469999999999801 | 1.244 |
| 3.479999999999801 | 1.247 |
| 3.489999999999801 | 1.25 |
| 3.499999999999801 | 1.253 |
| 3.5099999999998 | 1.256 |
| 3.5199999999998 | 1.258 |
| 3.5299999999998 | 1.261 |
| 3.5399999999998 | 1.264 |
| 3.5499999999998 | 1.267 |
| 3.559999999999799 | 1.27 |
| 3.569999999999799 | 1.273 |
| 3.579999999999799 | 1.275 |
| 3.589999999999799 | 1.278 |
| 3.599999999999798 | 1.281 |
| 3.609999999999798 | 1.284 |
| 3.619999999999798 | 1.286 |
| 3.629999999999798 | 1.289 |
| 3.639999999999798 | 1.292 |
| 3.649999999999797 | 1.295 |
| 3.659999999999797 | 1.297 |
| 3.669999999999797 | 1.3 |
| 3.679999999999797 | 1.303 |
| 3.689999999999796 | 1.306 |
| 3.699999999999796 | 1.308 |
| 3.709999999999796 | 1.311 |
| 3.719999999999796 | 1.314 |
| 3.729999999999796 | 1.316 |
| 3.739999999999795 | 1.319 |
| 3.749999999999795 | 1.322 |
| 3.759999999999795 | 1.324 |
| 3.769999999999795 | 1.327 |
| 3.779999999999795 | 1.33 |
| 3.789999999999794 | 1.332 |
| 3.799999999999794 | 1.335 |
| 3.809999999999794 | 1.338 |
| 3.819999999999794 | 1.34 |
| 3.829999999999794 | 1.343 |
| 3.839999999999793 | 1.345 |
| 3.849999999999793 | 1.348 |
| 3.859999999999793 | 1.351 |
| 3.869999999999793 | 1.353 |
| 3.879999999999792 | 1.356 |
| 3.889999999999792 | 1.358 |
| 3.899999999999792 | 1.361 |
| 3.909999999999792 | 1.364 |
| 3.919999999999792 | 1.366 |
| 3.929999999999791 | 1.369 |
| 3.939999999999791 | 1.371 |
| 3.949999999999791 | 1.374 |
| 3.959999999999791 | 1.376 |
| 3.969999999999791 | 1.379 |
| 3.97999999999979 | 1.381 |
| 3.98999999999979 | 1.384 |
| 3.99999999999979 | 1.386 |
| 4.00999999999979 | 1.389 |
| 4.01999999999979 | 1.391 |
| 4.02999999999979 | 1.394 |
| 4.03999999999979 | 1.396 |
| 4.04999999999979 | 1.399 |
| 4.05999999999979 | 1.401 |
| 4.069999999999789 | 1.404 |
| 4.079999999999788 | 1.406 |
| 4.089999999999788 | 1.409 |
| 4.099999999999788 | 1.411 |
| 4.109999999999788 | 1.413 |
| 4.119999999999788 | 1.416 |
| 4.129999999999788 | 1.418 |
| 4.139999999999787 | 1.421 |
| 4.149999999999787 | 1.423 |
| 4.159999999999787 | 1.426 |
| 4.169999999999787 | 1.428 |
| 4.179999999999786 | 1.43 |
| 4.189999999999786 | 1.433 |
| 4.199999999999786 | 1.435 |
| 4.209999999999785 | 1.437 |
| 4.219999999999785 | 1.44 |
| 4.229999999999785 | 1.442 |
| 4.239999999999785 | 1.445 |
| 4.249999999999785 | 1.447 |
| 4.259999999999784 | 1.449 |
| 4.269999999999784 | 1.452 |
| 4.279999999999784 | 1.454 |
| 4.289999999999784 | 1.456 |
| 4.299999999999784 | 1.459 |
| 4.309999999999784 | 1.461 |
| 4.319999999999784 | 1.463 |
| 4.329999999999783 | 1.466 |
| 4.339999999999783 | 1.468 |
| 4.349999999999783 | 1.47 |
| 4.359999999999783 | 1.472 |
| 4.369999999999782 | 1.475 |
| 4.379999999999782 | 1.477 |
| 4.389999999999782 | 1.479 |
| 4.399999999999782 | 1.482 |
| 4.409999999999781 | 1.484 |
| 4.419999999999781 | 1.486 |
| 4.429999999999781 | 1.488 |
| 4.43999999999978 | 1.491 |
| 4.44999999999978 | 1.493 |
| 4.45999999999978 | 1.495 |
| 4.46999999999978 | 1.497 |
| 4.47999999999978 | 1.5 |
| 4.48999999999978 | 1.502 |
| 4.49999999999978 | 1.504 |
| 4.50999999999978 | 1.506 |
| 4.51999999999978 | 1.509 |
| 4.52999999999978 | 1.511 |
| 4.539999999999778 | 1.513 |
| 4.549999999999778 | 1.515 |
| 4.559999999999778 | 1.517 |
| 4.569999999999778 | 1.52 |
| 4.579999999999778 | 1.522 |
| 4.589999999999777 | 1.524 |
| 4.599999999999777 | 1.526 |
| 4.609999999999777 | 1.528 |
| 4.619999999999777 | 1.53 |
| 4.629999999999777 | 1.533 |
| 4.639999999999776 | 1.535 |
| 4.649999999999776 | 1.537 |
| 4.659999999999776 | 1.539 |
| 4.669999999999776 | 1.541 |
| 4.679999999999775 | 1.543 |
| 4.689999999999775 | 1.545 |
| 4.699999999999775 | 1.548 |
| 4.709999999999775 | 1.55 |
| 4.719999999999774 | 1.552 |
| 4.729999999999774 | 1.554 |
| 4.739999999999774 | 1.556 |
| 4.749999999999774 | 1.558 |
| 4.759999999999774 | 1.56 |
| 4.769999999999774 | 1.562 |
| 4.779999999999773 | 1.564 |
| 4.789999999999773 | 1.567 |
| 4.799999999999773 | 1.569 |
| 4.809999999999773 | 1.571 |
| 4.819999999999773 | 1.573 |
| 4.829999999999773 | 1.575 |
| 4.839999999999772 | 1.577 |
| 4.849999999999772 | 1.579 |
| 4.859999999999772 | 1.581 |
| 4.869999999999772 | 1.583 |
| 4.879999999999771 | 1.585 |
| 4.889999999999771 | 1.587 |
| 4.899999999999771 | 1.589 |
| 4.90999999999977 | 1.591 |
| 4.91999999999977 | 1.593 |
| 4.92999999999977 | 1.595 |
| 4.93999999999977 | 1.597 |
| 4.94999999999977 | 1.599 |
| 4.95999999999977 | 1.601 |
| 4.96999999999977 | 1.603 |
| 4.97999999999977 | 1.605 |
| 4.98999999999977 | 1.607 |
| 4.99999999999977 | 1.609 |
| 5.009999999999768 | 1.611 |
| 5.019999999999768 | 1.613 |
| 5.029999999999768 | 1.615 |
| 5.039999999999768 | 1.617 |
| 5.049999999999767 | 1.619 |
| 5.059999999999767 | 1.621 |
| 5.069999999999767 | 1.623 |
| 5.079999999999767 | 1.625 |
| 5.089999999999767 | 1.627 |
| 5.099999999999766 | 1.629 |
| 5.109999999999766 | 1.631 |
| 5.119999999999766 | 1.633 |
| 5.129999999999766 | 1.635 |
| 5.139999999999766 | 1.637 |
| 5.149999999999765 | 1.639 |
| 5.159999999999765 | 1.641 |
| 5.169999999999765 | 1.643 |
| 5.179999999999765 | 1.645 |
| 5.189999999999764 | 1.647 |
| 5.199999999999764 | 1.649 |
| 5.209999999999764 | 1.651 |
| 5.219999999999764 | 1.652 |
| 5.229999999999764 | 1.654 |
| 5.239999999999763 | 1.656 |
| 5.249999999999763 | 1.658 |
| 5.259999999999763 | 1.66 |
| 5.269999999999763 | 1.662 |
| 5.279999999999763 | 1.664 |
| 5.289999999999762 | 1.666 |
| 5.299999999999762 | 1.668 |
| 5.309999999999762 | 1.67 |
| 5.319999999999762 | 1.671 |
| 5.329999999999762 | 1.673 |
| 5.339999999999761 | 1.675 |
| 5.349999999999761 | 1.677 |
| 5.359999999999761 | 1.679 |
| 5.369999999999761 | 1.681 |
| 5.37999999999976 | 1.683 |
| 5.38999999999976 | 1.685 |
| 5.39999999999976 | 1.686 |
| 5.40999999999976 | 1.688 |
| 5.41999999999976 | 1.69 |
| 5.42999999999976 | 1.692 |
| 5.43999999999976 | 1.694 |
| 5.44999999999976 | 1.696 |
| 5.45999999999976 | 1.697 |
| 5.46999999999976 | 1.699 |
| 5.479999999999758 | 1.701 |
| 5.489999999999758 | 1.703 |
| 5.499999999999758 | 1.705 |
| 5.509999999999758 | 1.707 |
| 5.519999999999758 | 1.708 |
| 5.529999999999758 | 1.71 |
| 5.539999999999757 | 1.712 |
| 5.549999999999757 | 1.714 |
| 5.559999999999757 | 1.716 |
| 5.569999999999757 | 1.717 |
| 5.579999999999756 | 1.719 |
| 5.589999999999756 | 1.721 |
| 5.599999999999756 | 1.723 |
| 5.609999999999756 | 1.725 |
| 5.619999999999756 | 1.726 |
| 5.629999999999756 | 1.728 |
| 5.639999999999755 | 1.73 |
| 5.649999999999755 | 1.732 |
| 5.659999999999755 | 1.733 |
| 5.669999999999755 | 1.735 |
| 5.679999999999754 | 1.737 |
| 5.689999999999754 | 1.739 |
| 5.699999999999754 | 1.74 |
| 5.709999999999754 | 1.742 |
| 5.719999999999754 | 1.744 |
| 5.729999999999753 | 1.746 |
| 5.739999999999753 | 1.747 |
| 5.749999999999753 | 1.749 |
| 5.759999999999753 | 1.751 |
| 5.769999999999753 | 1.753 |
| 5.779999999999752 | 1.754 |
| 5.789999999999752 | 1.756 |
| 5.799999999999752 | 1.758 |
| 5.809999999999752 | 1.76 |
| 5.819999999999752 | 1.761 |
| 5.829999999999751 | 1.763 |
| 5.839999999999751 | 1.765 |
| 5.849999999999751 | 1.766 |
| 5.859999999999751 | 1.768 |
| 5.86999999999975 | 1.77 |
| 5.87999999999975 | 1.772 |
| 5.88999999999975 | 1.773 |
| 5.89999999999975 | 1.775 |
| 5.90999999999975 | 1.777 |
| 5.91999999999975 | 1.778 |
| 5.92999999999975 | 1.78 |
| 5.93999999999975 | 1.782 |
| 5.949999999999748 | 1.783 |
| 5.959999999999748 | 1.785 |
| 5.969999999999748 | 1.787 |
| 5.979999999999748 | 1.788 |
| 5.989999999999747 | 1.79 |
| 5.999999999999747 | 1.792 |
| 6.009999999999747 | 1.793 |
| 6.019999999999747 | 1.795 |
| 6.029999999999747 | 1.797 |
| 6.039999999999746 | 1.798 |
| 6.049999999999746 | 1.8 |
| 6.059999999999746 | 1.802 |
| 6.069999999999746 | 1.803 |
| 6.079999999999746 | 1.805 |
| 6.089999999999745 | 1.807 |
| 6.099999999999745 | 1.808 |
| 6.109999999999745 | 1.81 |
| 6.119999999999745 | 1.812 |
| 6.129999999999745 | 1.813 |
| 6.139999999999744 | 1.815 |
| 6.149999999999744 | 1.816 |
| 6.159999999999744 | 1.818 |
| 6.169999999999744 | 1.82 |
| 6.179999999999744 | 1.821 |
| 6.189999999999744 | 1.823 |
| 6.199999999999743 | 1.825 |
| 6.209999999999743 | 1.826 |
| 6.219999999999743 | 1.828 |
| 6.229999999999743 | 1.829 |
| 6.239999999999742 | 1.831 |
| 6.249999999999742 | 1.833 |
| 6.259999999999742 | 1.834 |
| 6.269999999999742 | 1.836 |
| 6.279999999999741 | 1.837 |
| 6.289999999999741 | 1.839 |
| 6.299999999999741 | 1.841 |
| 6.309999999999741 | 1.842 |
| 6.319999999999741 | 1.844 |
| 6.329999999999741 | 1.845 |
| 6.33999999999974 | 1.847 |
| 6.34999999999974 | 1.848 |
| 6.35999999999974 | 1.85 |
| 6.36999999999974 | 1.852 |
| 6.37999999999974 | 1.853 |
| 6.38999999999974 | 1.855 |
| 6.39999999999974 | 1.856 |
| 6.409999999999738 | 1.858 |
| 6.419999999999738 | 1.859 |
| 6.429999999999738 | 1.861 |
| 6.439999999999738 | 1.863 |
| 6.449999999999738 | 1.864 |
| 6.459999999999737 | 1.866 |
| 6.469999999999737 | 1.867 |
| 6.479999999999737 | 1.869 |
| 6.489999999999737 | 1.87 |
| 6.499999999999737 | 1.872 |
| 6.509999999999736 | 1.873 |
| 6.519999999999736 | 1.875 |
| 6.529999999999736 | 1.876 |
| 6.539999999999736 | 1.878 |
| 6.549999999999736 | 1.879 |
| 6.559999999999735 | 1.881 |
| 6.569999999999735 | 1.883 |
| 6.579999999999735 | 1.884 |
| 6.589999999999735 | 1.886 |
| 6.599999999999734 | 1.887 |
| 6.609999999999734 | 1.889 |
| 6.619999999999734 | 1.89 |
| 6.629999999999734 | 1.892 |
| 6.639999999999734 | 1.893 |
| 6.649999999999734 | 1.895 |
| 6.659999999999734 | 1.896 |
| 6.669999999999733 | 1.898 |
| 6.679999999999733 | 1.899 |
| 6.689999999999733 | 1.901 |
| 6.699999999999733 | 1.902 |
| 6.709999999999732 | 1.904 |
| 6.719999999999732 | 1.905 |
| 6.729999999999732 | 1.907 |
| 6.739999999999731 | 1.908 |
| 6.749999999999731 | 1.91 |
| 6.759999999999731 | 1.911 |
| 6.769999999999731 | 1.913 |
| 6.77999999999973 | 1.914 |
| 6.78999999999973 | 1.915 |
| 6.79999999999973 | 1.917 |
| 6.80999999999973 | 1.918 |
| 6.81999999999973 | 1.92 |
| 6.82999999999973 | 1.921 |
| 6.83999999999973 | 1.923 |
| 6.84999999999973 | 1.924 |
| 6.85999999999973 | 1.926 |
| 6.86999999999973 | 1.927 |
| 6.879999999999728 | 1.929 |
| 6.889999999999728 | 1.93 |
| 6.899999999999728 | 1.932 |
| 6.909999999999728 | 1.933 |
| 6.919999999999728 | 1.934 |
| 6.929999999999727 | 1.936 |
| 6.939999999999727 | 1.937 |
| 6.949999999999727 | 1.939 |
| 6.959999999999727 | 1.94 |
| 6.969999999999727 | 1.942 |
| 6.979999999999726 | 1.943 |
| 6.989999999999726 | 1.944 |
| 6.999999999999726 | 1.946 |
| 7.009999999999726 | 1.947 |
| 7.019999999999726 | 1.949 |
| 7.029999999999725 | 1.95 |
| 7.039999999999725 | 1.952 |
| 7.049999999999725 | 1.953 |
| 7.059999999999725 | 1.954 |
| 7.069999999999724 | 1.956 |
| 7.079999999999724 | 1.957 |
| 7.089999999999724 | 1.959 |
| 7.099999999999724 | 1.96 |
| 7.109999999999724 | 1.962 |
| 7.119999999999724 | 1.963 |
| 7.129999999999724 | 1.964 |
| 7.139999999999723 | 1.966 |
| 7.149999999999723 | 1.967 |
| 7.159999999999723 | 1.969 |
| 7.169999999999723 | 1.97 |
| 7.179999999999722 | 1.971 |
| 7.189999999999722 | 1.973 |
| 7.199999999999722 | 1.974 |
| 7.209999999999721 | 1.975 |
| 7.219999999999721 | 1.977 |
| 7.229999999999721 | 1.978 |
| 7.23999999999972 | 1.98 |
| 7.24999999999972 | 1.981 |
| 7.25999999999972 | 1.982 |
| 7.26999999999972 | 1.984 |
| 7.27999999999972 | 1.985 |
| 7.28999999999972 | 1.987 |
| 7.29999999999972 | 1.988 |
| 7.30999999999972 | 1.989 |
| 7.31999999999972 | 1.991 |
| 7.329999999999719 | 1.992 |
| 7.33999999999972 | 1.993 |
| 7.349999999999719 | 1.995 |
| 7.359999999999719 | 1.996 |
| 7.369999999999718 | 1.997 |
| 7.379999999999718 | 1.999 |
| 7.389999999999718 | 2 |
| 7.399999999999718 | 2.001 |
| 7.409999999999717 | 2.003 |
| 7.419999999999717 | 2.004 |
| 7.429999999999717 | 2.006 |
| 7.439999999999717 | 2.007 |
| 7.449999999999716 | 2.008 |
| 7.459999999999716 | 2.01 |
| 7.469999999999716 | 2.011 |
| 7.479999999999716 | 2.012 |
| 7.489999999999715 | 2.014 |
| 7.499999999999715 | 2.015 |
| 7.509999999999715 | 2.016 |
| 7.519999999999715 | 2.018 |
| 7.529999999999715 | 2.019 |
| 7.539999999999714 | 2.02 |
| 7.549999999999714 | 2.022 |
| 7.559999999999714 | 2.023 |
| 7.569999999999714 | 2.024 |
| 7.579999999999714 | 2.026 |
| 7.589999999999714 | 2.027 |
| 7.599999999999714 | 2.028 |
| 7.609999999999713 | 2.029 |
| 7.619999999999713 | 2.031 |
| 7.629999999999713 | 2.032 |
| 7.639999999999713 | 2.033 |
| 7.649999999999712 | 2.035 |
| 7.659999999999712 | 2.036 |
| 7.669999999999712 | 2.037 |
| 7.679999999999712 | 2.039 |
| 7.689999999999712 | 2.04 |
| 7.699999999999711 | 2.041 |
| 7.709999999999711 | 2.043 |
| 7.719999999999711 | 2.044 |
| 7.729999999999711 | 2.045 |
| 7.73999999999971 | 2.046 |
| 7.74999999999971 | 2.048 |
| 7.75999999999971 | 2.049 |
| 7.76999999999971 | 2.05 |
| 7.77999999999971 | 2.052 |
| 7.78999999999971 | 2.053 |
| 7.79999999999971 | 2.054 |
| 7.80999999999971 | 2.055 |
| 7.819999999999709 | 2.057 |
| 7.829999999999709 | 2.058 |
| 7.839999999999708 | 2.059 |
| 7.849999999999708 | 2.061 |
| 7.859999999999708 | 2.062 |
| 7.869999999999708 | 2.063 |
| 7.879999999999707 | 2.064 |
| 7.889999999999707 | 2.066 |
| 7.899999999999707 | 2.067 |
| 7.909999999999707 | 2.068 |
| 7.919999999999706 | 2.069 |
| 7.929999999999706 | 2.071 |
| 7.939999999999706 | 2.072 |
| 7.949999999999706 | 2.073 |
| 7.959999999999705 | 2.074 |
| 7.969999999999705 | 2.076 |
| 7.979999999999705 | 2.077 |
| 7.989999999999705 | 2.078 |
| 7.999999999999705 | 2.079 |
| 8.009999999999703 | 2.081 |
| 8.019999999999705 | 2.082 |
| 8.029999999999704 | 2.083 |
| 8.039999999999704 | 2.084 |
| 8.049999999999704 | 2.086 |
| 8.059999999999704 | 2.087 |
| 8.069999999999704 | 2.088 |
| 8.079999999999703 | 2.089 |
| 8.089999999999703 | 2.091 |
| 8.099999999999701 | 2.092 |
| 8.109999999999703 | 2.093 |
| 8.119999999999703 | 2.094 |
| 8.129999999999702 | 2.096 |
| 8.139999999999702 | 2.097 |
| 8.1499999999997 | 2.098 |
| 8.1599999999997 | 2.099 |
| 8.1699999999997 | 2.1 |
| 8.1799999999997 | 2.102 |
| 8.1899999999997 | 2.103 |
| 8.1999999999997 | 2.104 |
| 8.2099999999997 | 2.105 |
| 8.2199999999997 | 2.107 |
| 8.2299999999997 | 2.108 |
| 8.2399999999997 | 2.109 |
| 8.2499999999997 | 2.11 |
| 8.2599999999997 | 2.111 |
| 8.2699999999997 | 2.113 |
| 8.2799999999997 | 2.114 |
| 8.289999999999697 | 2.115 |
| 8.299999999999699 | 2.116 |
| 8.309999999999699 | 2.117 |
| 8.319999999999698 | 2.119 |
| 8.329999999999698 | 2.12 |
| 8.339999999999698 | 2.121 |
| 8.349999999999698 | 2.122 |
| 8.359999999999697 | 2.123 |
| 8.369999999999697 | 2.125 |
| 8.379999999999695 | 2.126 |
| 8.389999999999697 | 2.127 |
| 8.399999999999697 | 2.128 |
| 8.409999999999696 | 2.129 |
| 8.419999999999696 | 2.131 |
| 8.429999999999694 | 2.132 |
| 8.439999999999696 | 2.133 |
| 8.449999999999696 | 2.134 |
| 8.459999999999695 | 2.135 |
| 8.469999999999695 | 2.137 |
| 8.479999999999693 | 2.138 |
| 8.489999999999695 | 2.139 |
| 8.499999999999694 | 2.14 |
| 8.509999999999694 | 2.141 |
| 8.519999999999694 | 2.142 |
| 8.529999999999694 | 2.144 |
| 8.539999999999694 | 2.145 |
| 8.549999999999693 | 2.146 |
| 8.55999999999969 | 2.147 |
| 8.56999999999969 | 2.148 |
| 8.57999999999969 | 2.149 |
| 8.58999999999969 | 2.151 |
| 8.59999999999969 | 2.152 |
| 8.60999999999969 | 2.153 |
| 8.61999999999969 | 2.154 |
| 8.62999999999969 | 2.155 |
| 8.63999999999969 | 2.156 |
| 8.64999999999969 | 2.158 |
| 8.65999999999969 | 2.159 |
| 8.66999999999969 | 2.16 |
| 8.67999999999969 | 2.161 |
| 8.68999999999969 | 2.162 |
| 8.69999999999969 | 2.163 |
| 8.70999999999969 | 2.164 |
| 8.71999999999969 | 2.166 |
| 8.72999999999969 | 2.167 |
| 8.73999999999969 | 2.168 |
| 8.74999999999969 | 2.169 |
| 8.759999999999687 | 2.17 |
| 8.769999999999689 | 2.171 |
| 8.779999999999688 | 2.172 |
| 8.789999999999688 | 2.174 |
| 8.799999999999686 | 2.175 |
| 8.809999999999688 | 2.176 |
| 8.819999999999688 | 2.177 |
| 8.829999999999687 | 2.178 |
| 8.839999999999687 | 2.179 |
| 8.849999999999685 | 2.18 |
| 8.859999999999687 | 2.182 |
| 8.869999999999687 | 2.183 |
| 8.879999999999686 | 2.184 |
| 8.889999999999686 | 2.185 |
| 8.899999999999684 | 2.186 |
| 8.909999999999686 | 2.187 |
| 8.919999999999686 | 2.188 |
| 8.929999999999685 | 2.189 |
| 8.939999999999685 | 2.191 |
| 8.949999999999685 | 2.192 |
| 8.959999999999685 | 2.193 |
| 8.969999999999684 | 2.194 |
| 8.979999999999684 | 2.195 |
| 8.989999999999682 | 2.196 |
| 8.999999999999684 | 2.197 |
| 9.009999999999684 | 2.198 |
| 9.019999999999683 | 2.199 |
| 9.029999999999683 | 2.201 |
| 9.039999999999681 | 2.202 |
| 9.049999999999683 | 2.203 |
| 9.05999999999968 | 2.204 |
| 9.06999999999968 | 2.205 |
| 9.07999999999968 | 2.206 |
| 9.08999999999968 | 2.207 |
| 9.09999999999968 | 2.208 |
| 9.10999999999968 | 2.209 |
| 9.11999999999968 | 2.21 |
| 9.12999999999968 | 2.212 |
| 9.13999999999968 | 2.213 |
| 9.14999999999968 | 2.214 |
| 9.15999999999968 | 2.215 |
| 9.16999999999968 | 2.216 |
| 9.17999999999968 | 2.217 |
| 9.18999999999968 | 2.218 |
| 9.19999999999968 | 2.219 |
| 9.20999999999968 | 2.22 |
| 9.21999999999968 | 2.221 |
| 9.229999999999677 | 2.222 |
| 9.239999999999679 | 2.224 |
| 9.249999999999678 | 2.225 |
| 9.259999999999678 | 2.226 |
| 9.269999999999678 | 2.227 |
| 9.279999999999678 | 2.228 |
| 9.289999999999678 | 2.229 |
| 9.299999999999677 | 2.23 |
| 9.309999999999677 | 2.231 |
| 9.319999999999675 | 2.232 |
| 9.329999999999677 | 2.233 |
| 9.339999999999677 | 2.234 |
| 9.349999999999676 | 2.235 |
| 9.359999999999676 | 2.236 |
| 9.369999999999674 | 2.238 |
| 9.379999999999676 | 2.239 |
| 9.389999999999675 | 2.24 |
| 9.399999999999675 | 2.241 |
| 9.409999999999675 | 2.242 |
| 9.419999999999675 | 2.243 |
| 9.429999999999675 | 2.244 |
| 9.439999999999674 | 2.245 |
| 9.449999999999674 | 2.246 |
| 9.459999999999672 | 2.247 |
| 9.469999999999674 | 2.248 |
| 9.479999999999674 | 2.249 |
| 9.489999999999673 | 2.25 |
| 9.499999999999673 | 2.251 |
| 9.509999999999671 | 2.252 |
| 9.519999999999673 | 2.253 |
| 9.529999999999673 | 2.254 |
| 9.539999999999672 | 2.255 |
| 9.549999999999672 | 2.257 |
| 9.55999999999967 | 2.258 |
| 9.56999999999967 | 2.259 |
| 9.57999999999967 | 2.26 |
| 9.58999999999967 | 2.261 |
| 9.59999999999967 | 2.262 |
| 9.60999999999967 | 2.263 |
| 9.61999999999967 | 2.264 |
| 9.62999999999967 | 2.265 |
| 9.63999999999967 | 2.266 |
| 9.64999999999967 | 2.267 |
| 9.65999999999967 | 2.268 |
| 9.66999999999967 | 2.269 |
| 9.67999999999967 | 2.27 |
| 9.689999999999667 | 2.271 |
| 9.699999999999669 | 2.272 |
| 9.709999999999669 | 2.273 |
| 9.719999999999668 | 2.274 |
| 9.729999999999668 | 2.275 |
| 9.739999999999666 | 2.276 |
| 9.749999999999668 | 2.277 |
| 9.759999999999668 | 2.278 |
| 9.769999999999667 | 2.279 |
| 9.779999999999667 | 2.28 |
| 9.789999999999665 | 2.281 |
| 9.799999999999667 | 2.282 |
| 9.809999999999667 | 2.283 |
| 9.819999999999666 | 2.284 |
| 9.829999999999666 | 2.285 |
| 9.839999999999664 | 2.286 |
| 9.849999999999666 | 2.287 |
| 9.859999999999665 | 2.288 |
| 9.869999999999665 | 2.289 |
| 9.879999999999663 | 2.291 |
| 9.889999999999665 | 2.292 |
| 9.899999999999665 | 2.293 |
| 9.909999999999664 | 2.294 |
| 9.919999999999664 | 2.295 |
| 9.929999999999662 | 2.296 |
| 9.939999999999664 | 2.297 |
| 9.949999999999664 | 2.298 |
| 9.95999999999966 | 2.299 |
| 9.96999999999966 | 2.3 |
| 9.97999999999966 | 2.301 |
| 9.98999999999966 | 2.302 |
| 9.99999999999966 | 2.303 |